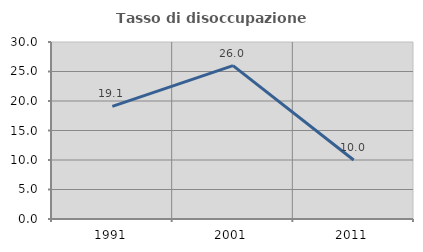
| Category | Tasso di disoccupazione giovanile  |
|---|---|
| 1991.0 | 19.101 |
| 2001.0 | 26 |
| 2011.0 | 10 |